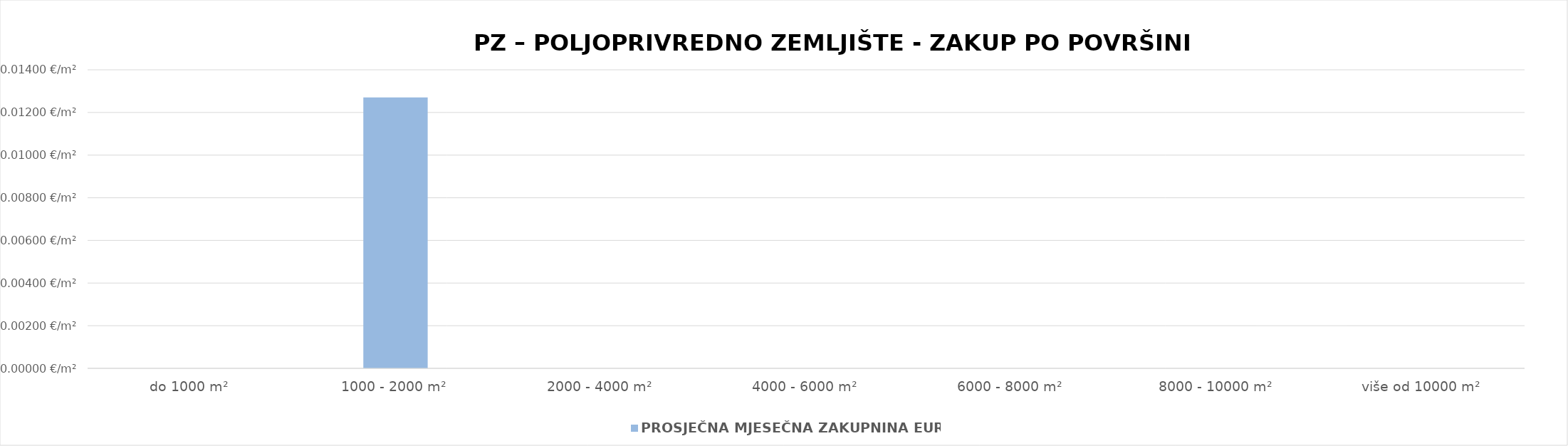
| Category | PROSJEČNA MJESEČNA ZAKUPNINA EUR/m2 |
|---|---|
| do 1000 m² | 0 |
| 1000 - 2000 m² | 0.013 |
| 2000 - 4000 m² | 0 |
| 4000 - 6000 m² | 0 |
| 6000 - 8000 m² | 0 |
| 8000 - 10000 m² | 0 |
| više od 10000 m² | 0 |